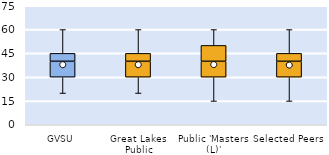
| Category | 25th | 50th | 75th |
|---|---|---|---|
| GVSU | 30 | 10 | 5 |
| Great Lakes Public | 30 | 10 | 5 |
| Public 'Masters (L)' | 30 | 10 | 10 |
| Selected Peers | 30 | 10 | 5 |